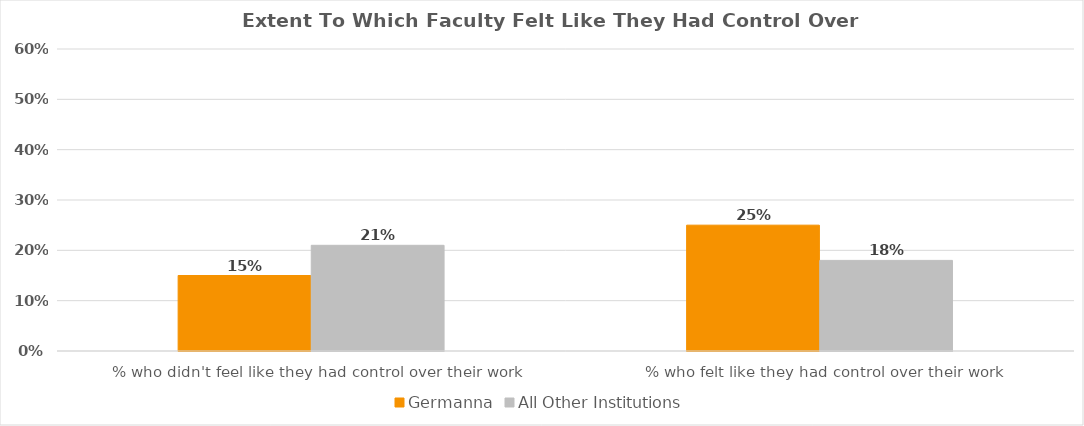
| Category | Germanna | All Other Institutions |
|---|---|---|
| % who didn't feel like they had control over their work
 | 0.15 | 0.21 |
| % who felt like they had control over their work
 | 0.25 | 0.18 |